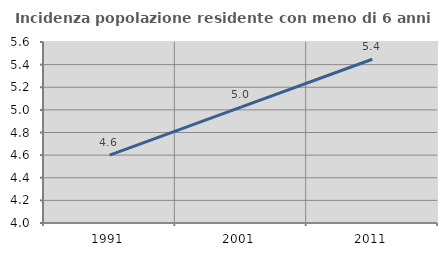
| Category | Incidenza popolazione residente con meno di 6 anni |
|---|---|
| 1991.0 | 4.601 |
| 2001.0 | 5.025 |
| 2011.0 | 5.448 |